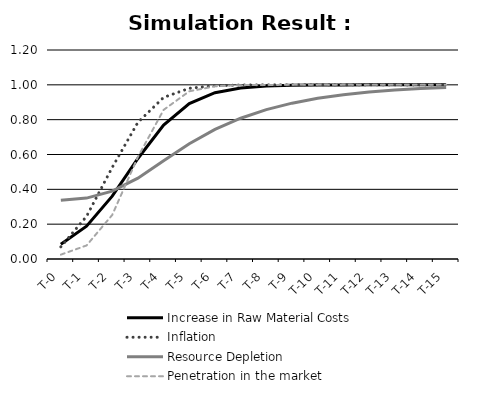
| Category | Increase in Raw Material Costs | Inflation | Resource Depletion | Penetration in the market |
|---|---|---|---|---|
| T-0 | 0.085 | 0.07 | 0.337 | 0.025 |
| T-1 | 0.189 | 0.245 | 0.35 | 0.078 |
| T-2 | 0.361 | 0.526 | 0.389 | 0.253 |
| T-3 | 0.577 | 0.785 | 0.464 | 0.586 |
| T-4 | 0.769 | 0.928 | 0.564 | 0.856 |
| T-5 | 0.892 | 0.98 | 0.662 | 0.963 |
| T-6 | 0.955 | 0.995 | 0.744 | 0.992 |
| T-7 | 0.982 | 0.999 | 0.808 | 0.998 |
| T-8 | 0.993 | 1 | 0.857 | 1 |
| T-9 | 0.998 | 1 | 0.895 | 1 |
| T-10 | 0.999 | 1 | 0.923 | 1 |
| T-11 | 1 | 1 | 0.943 | 1 |
| T-12 | 1 | 1 | 0.959 | 1 |
| T-13 | 1 | 1 | 0.97 | 1 |
| T-14 | 1 | 1 | 0.978 | 1 |
| T-15 | 1 | 1 | 0.984 | 1 |